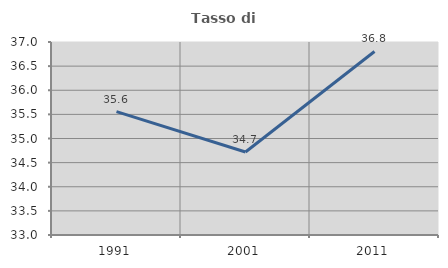
| Category | Tasso di occupazione   |
|---|---|
| 1991.0 | 35.556 |
| 2001.0 | 34.719 |
| 2011.0 | 36.804 |